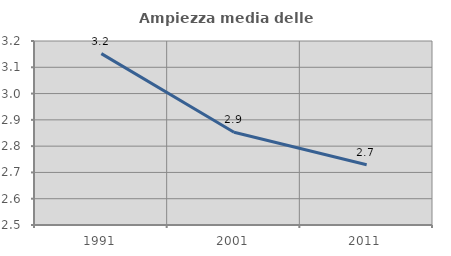
| Category | Ampiezza media delle famiglie |
|---|---|
| 1991.0 | 3.152 |
| 2001.0 | 2.853 |
| 2011.0 | 2.729 |